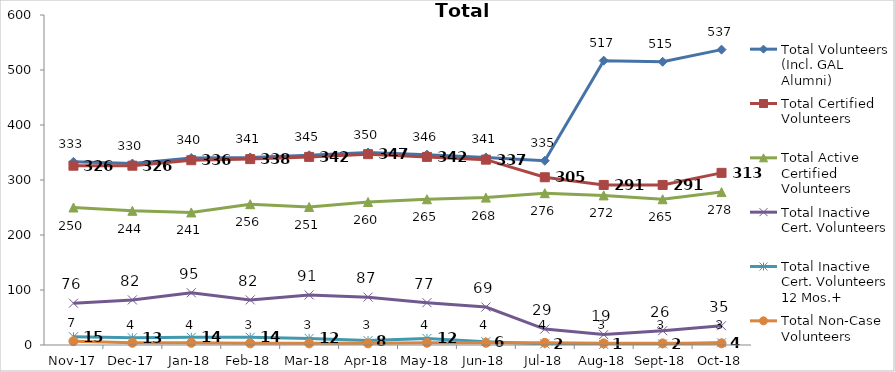
| Category | Total Volunteers (Incl. GAL Alumni) | Total Certified Volunteers | Total Active Certified Volunteers | Total Inactive Cert. Volunteers | Total Inactive Cert. Volunteers 12 Mos.+ | Total Non-Case Volunteers |
|---|---|---|---|---|---|---|
| 2017-11-01 | 333 | 326 | 250 | 76 | 15 | 7 |
| 2017-12-01 | 330 | 326 | 244 | 82 | 13 | 4 |
| 2018-01-01 | 340 | 336 | 241 | 95 | 14 | 4 |
| 2018-02-01 | 341 | 338 | 256 | 82 | 14 | 3 |
| 2018-03-01 | 345 | 342 | 251 | 91 | 12 | 3 |
| 2018-04-01 | 350 | 347 | 260 | 87 | 8 | 3 |
| 2018-05-01 | 346 | 342 | 265 | 77 | 12 | 4 |
| 2018-06-01 | 341 | 337 | 268 | 69 | 6 | 4 |
| 2018-07-01 | 335 | 305 | 276 | 29 | 2 | 4 |
| 2018-08-01 | 517 | 291 | 272 | 19 | 1 | 3 |
| 2018-09-01 | 515 | 291 | 265 | 26 | 2 | 3 |
| 2018-10-01 | 537 | 313 | 278 | 35 | 4 | 3 |